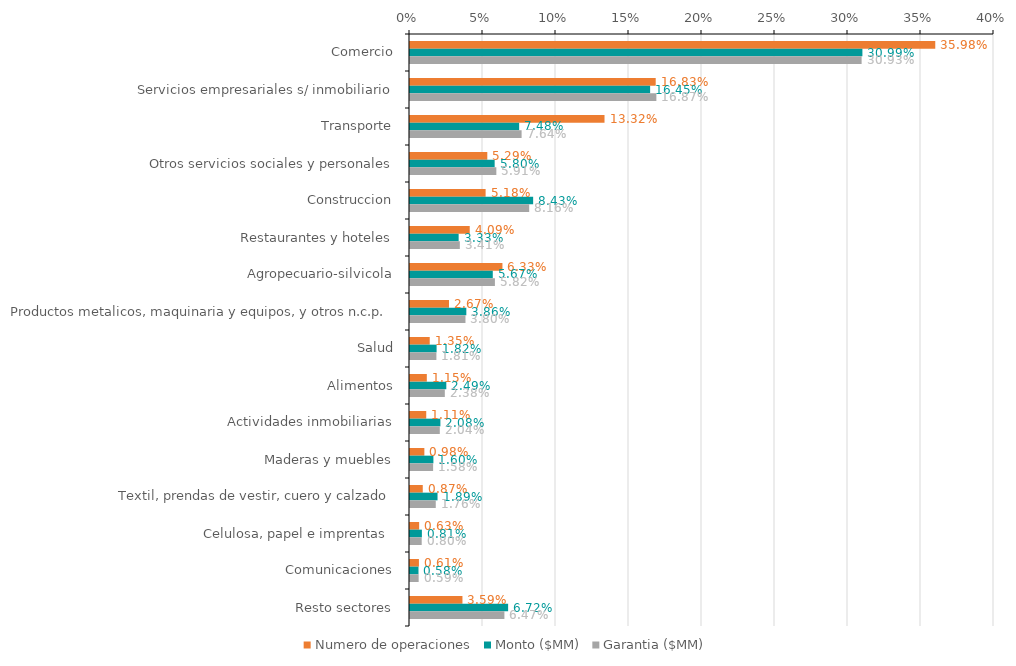
| Category | Numero de operaciones | Monto ($MM) | Garantia ($MM) |
|---|---|---|---|
| Comercio | 0.36 | 0.31 | 0.309 |
| Servicios empresariales s/ inmobiliario | 0.168 | 0.164 | 0.169 |
| Transporte | 0.133 | 0.075 | 0.076 |
| Otros servicios sociales y personales | 0.053 | 0.058 | 0.059 |
| Construccion | 0.052 | 0.084 | 0.082 |
| Restaurantes y hoteles | 0.041 | 0.033 | 0.034 |
| Agropecuario-silvicola | 0.063 | 0.057 | 0.058 |
| Productos metalicos, maquinaria y equipos, y otros n.c.p. | 0.027 | 0.039 | 0.038 |
| Salud | 0.014 | 0.018 | 0.018 |
| Alimentos | 0.012 | 0.025 | 0.024 |
| Actividades inmobiliarias | 0.011 | 0.021 | 0.02 |
| Maderas y muebles | 0.01 | 0.016 | 0.016 |
| Textil, prendas de vestir, cuero y calzado | 0.009 | 0.019 | 0.018 |
| Celulosa, papel e imprentas  | 0.006 | 0.008 | 0.008 |
| Comunicaciones | 0.006 | 0.006 | 0.006 |
| Resto sectores | 0.036 | 0.067 | 0.065 |